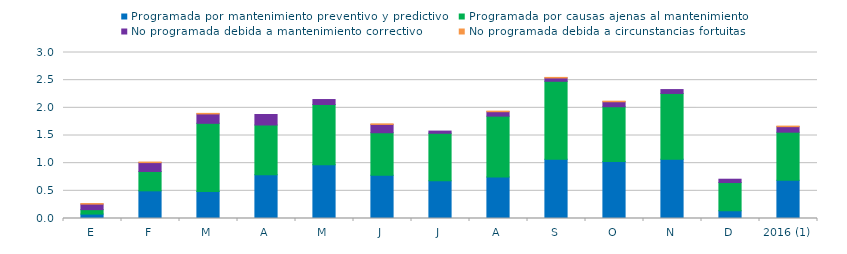
| Category | Programada por mantenimiento preventivo y predictivo | Programada por causas ajenas al mantenimiento  | No programada debida a mantenimiento correctivo  | No programada debida a circunstancias fortuitas  |
|---|---|---|---|---|
| E | 0.08 | 0.08 | 0.1 | 0.01 |
| F | 0.5 | 0.35 | 0.16 | 0.01 |
| M | 0.49 | 1.23 | 0.17 | 0.01 |
| A | 0.79 | 0.9 | 0.19 | 0 |
| M | 0.97 | 1.09 | 0.09 | 0 |
| J | 0.78 | 0.77 | 0.15 | 0.01 |
| J | 0.68 | 0.86 | 0.04 | 0 |
| A | 0.75 | 1.1 | 0.08 | 0.01 |
| S | 1.07 | 1.41 | 0.06 | 0.01 |
| O | 1.03 | 0.99 | 0.09 | 0.01 |
| N | 1.07 | 1.19 | 0.07 | 0 |
| D | 0.14 | 0.51 | 0.06 | 0 |
| 2016 (1) | 0.69 | 0.87 | 0.1 | 0.01 |